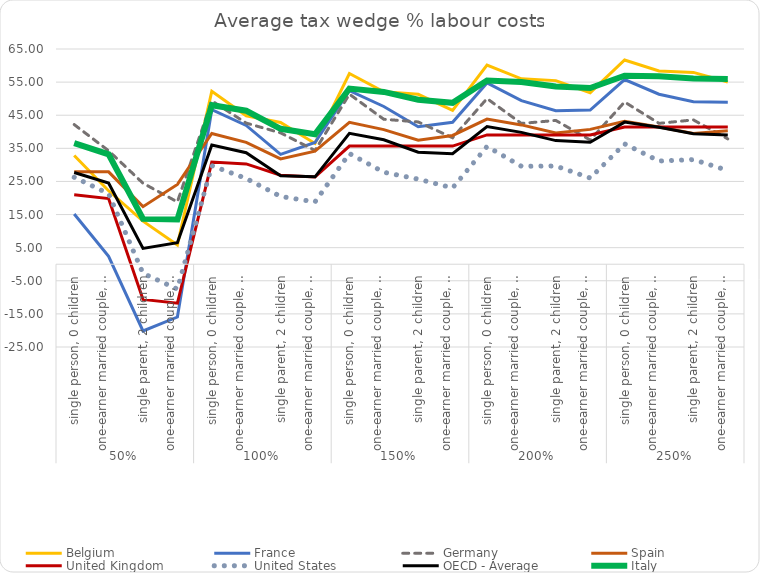
| Category | Belgium | France | Germany | Spain | United Kingdom | United States | OECD - Average | Italy |
|---|---|---|---|---|---|---|---|---|
| 0 | 32.841 | 15.178 | 42.17 | 27.906 | 20.961 | 26.259 | 27.703 | 36.55 |
| 1 | 22.179 | 2.364 | 34.271 | 27.906 | 19.826 | 21.296 | 24.502 | 33.207 |
| 2 | 12.996 | -20.154 | 24.467 | 17.384 | -10.648 | -2.748 | 4.762 | 13.689 |
| 3 | 5.78 | -15.947 | 18.818 | 24.093 | -11.783 | -7.517 | 6.475 | 13.494 |
| 4 | 52.242 | 46.667 | 49.352 | 39.487 | 30.857 | 29.757 | 35.971 | 48.012 |
| 5 | 44.844 | 41.914 | 42.622 | 36.797 | 30.305 | 25.897 | 33.684 | 46.352 |
| 6 | 42.821 | 33.179 | 39.675 | 31.793 | 26.882 | 20.47 | 26.698 | 40.895 |
| 7 | 36.465 | 36.769 | 34.347 | 34.159 | 26.329 | 18.812 | 26.392 | 39.236 |
| 8 | 57.606 | 52.401 | 51.36 | 42.839 | 35.678 | 33.435 | 39.54 | 53.056 |
| 9 | 52.062 | 47.642 | 43.778 | 40.658 | 35.678 | 27.771 | 37.579 | 52.03 |
| 10 | 51.325 | 41.514 | 42.972 | 37.429 | 35.678 | 25.703 | 33.839 | 49.678 |
| 11 | 46.475 | 42.867 | 38.186 | 38.899 | 35.678 | 23.04 | 33.384 | 48.749 |
| 12 | 60.162 | 54.735 | 50.026 | 43.852 | 39.06 | 35.566 | 41.571 | 55.507 |
| 13 | 56.004 | 49.392 | 42.517 | 42.076 | 39.06 | 29.584 | 39.824 | 55.031 |
| 14 | 55.451 | 46.362 | 43.427 | 39.652 | 39.06 | 29.662 | 37.339 | 53.699 |
| 15 | 51.814 | 46.561 | 37.509 | 40.722 | 39.06 | 26.033 | 36.841 | 53.222 |
| 16 | 61.693 | 55.779 | 48.991 | 43.186 | 41.425 | 36.345 | 42.917 | 56.941 |
| 17 | 58.366 | 51.337 | 42.545 | 41.413 | 41.425 | 31.166 | 41.383 | 56.794 |
| 18 | 57.924 | 49.08 | 43.587 | 39.496 | 41.425 | 31.601 | 39.412 | 56.086 |
| 19 | 55.014 | 48.952 | 37.858 | 40.282 | 41.425 | 28.312 | 39.06 | 55.94 |